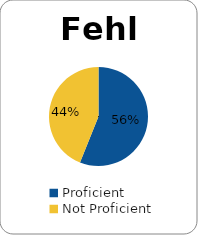
| Category | Series 0 |
|---|---|
| Proficient | 0.561 |
| Not Proficient | 0.439 |